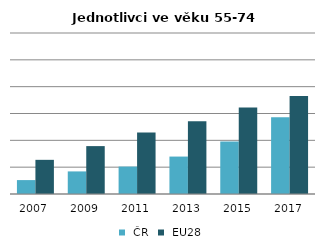
| Category |  ČR |  EU28 |
|---|---|---|
| 2007.0 | 0.052 | 0.127 |
| 2009.0 | 0.084 | 0.178 |
| 2011.0 | 0.102 | 0.23 |
| 2013.0 | 0.14 | 0.271 |
| 2015.0 | 0.196 | 0.322 |
| 2017.0 | 0.286 | 0.365 |